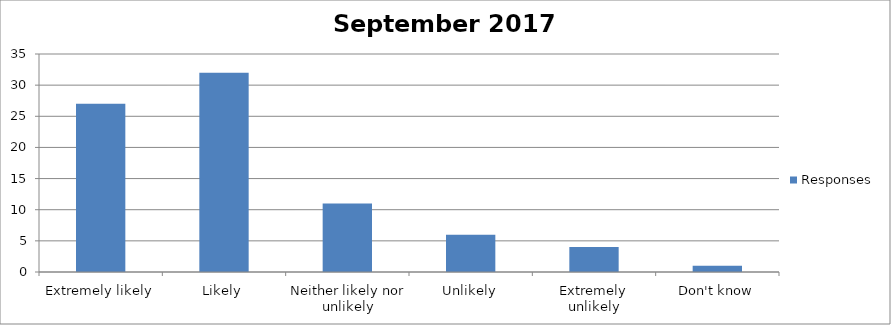
| Category | Responses |
|---|---|
| Extremely likely | 27 |
| Likely | 32 |
| Neither likely nor unlikely | 11 |
| Unlikely | 6 |
| Extremely unlikely | 4 |
| Don't know | 1 |